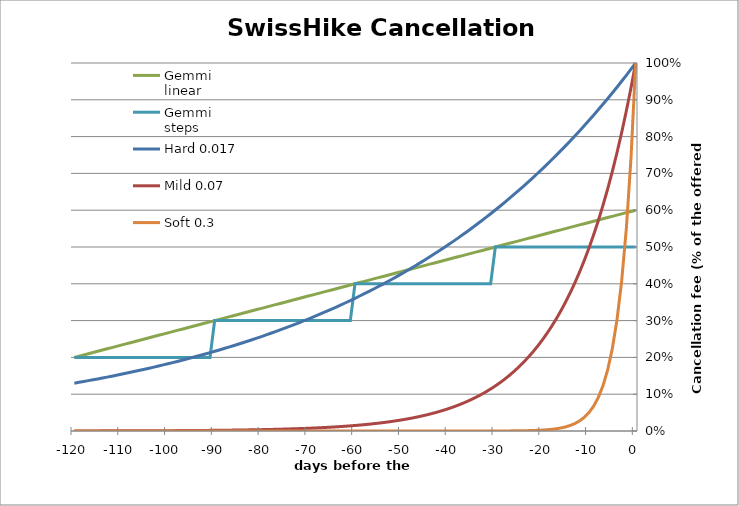
| Category | Gemmi linear | Gemmi steps | Hard 0.017 | Mild 0.07 | Soft 0.3 |
|---|---|---|---|---|---|
| -120.0 | 0.2 | 0.2 | 0.13 | 0 | 0 |
| -119.0 | 0.203 | 0.2 | 0.132 | 0 | 0 |
| -118.0 | 0.207 | 0.2 | 0.135 | 0 | 0 |
| -117.0 | 0.21 | 0.2 | 0.137 | 0 | 0 |
| -116.0 | 0.213 | 0.2 | 0.139 | 0 | 0 |
| -115.0 | 0.217 | 0.2 | 0.142 | 0 | 0 |
| -114.0 | 0.22 | 0.2 | 0.144 | 0 | 0 |
| -113.0 | 0.223 | 0.2 | 0.146 | 0 | 0 |
| -112.0 | 0.227 | 0.2 | 0.149 | 0 | 0 |
| -111.0 | 0.23 | 0.2 | 0.152 | 0 | 0 |
| -110.0 | 0.233 | 0.2 | 0.154 | 0 | 0 |
| -109.0 | 0.237 | 0.2 | 0.157 | 0 | 0 |
| -108.0 | 0.24 | 0.2 | 0.159 | 0.001 | 0 |
| -107.0 | 0.243 | 0.2 | 0.162 | 0.001 | 0 |
| -106.0 | 0.247 | 0.2 | 0.165 | 0.001 | 0 |
| -105.0 | 0.25 | 0.2 | 0.168 | 0.001 | 0 |
| -104.0 | 0.253 | 0.2 | 0.171 | 0.001 | 0 |
| -103.0 | 0.257 | 0.2 | 0.174 | 0.001 | 0 |
| -102.0 | 0.26 | 0.2 | 0.177 | 0.001 | 0 |
| -101.0 | 0.263 | 0.2 | 0.18 | 0.001 | 0 |
| -100.0 | 0.267 | 0.2 | 0.183 | 0.001 | 0 |
| -99.0 | 0.27 | 0.2 | 0.186 | 0.001 | 0 |
| -98.0 | 0.273 | 0.2 | 0.189 | 0.001 | 0 |
| -97.0 | 0.277 | 0.2 | 0.192 | 0.001 | 0 |
| -96.0 | 0.28 | 0.2 | 0.196 | 0.001 | 0 |
| -95.0 | 0.283 | 0.2 | 0.199 | 0.001 | 0 |
| -94.0 | 0.287 | 0.2 | 0.202 | 0.001 | 0 |
| -93.0 | 0.29 | 0.2 | 0.206 | 0.001 | 0 |
| -92.0 | 0.293 | 0.2 | 0.209 | 0.002 | 0 |
| -91.0 | 0.297 | 0.2 | 0.213 | 0.002 | 0 |
| -90.0 | 0.3 | 0.3 | 0.217 | 0.002 | 0 |
| -89.0 | 0.303 | 0.3 | 0.22 | 0.002 | 0 |
| -88.0 | 0.307 | 0.3 | 0.224 | 0.002 | 0 |
| -87.0 | 0.31 | 0.3 | 0.228 | 0.002 | 0 |
| -86.0 | 0.313 | 0.3 | 0.232 | 0.002 | 0 |
| -85.0 | 0.317 | 0.3 | 0.236 | 0.003 | 0 |
| -84.0 | 0.32 | 0.3 | 0.24 | 0.003 | 0 |
| -83.0 | 0.323 | 0.3 | 0.244 | 0.003 | 0 |
| -82.0 | 0.327 | 0.3 | 0.248 | 0.003 | 0 |
| -81.0 | 0.33 | 0.3 | 0.252 | 0.003 | 0 |
| -80.0 | 0.333 | 0.3 | 0.257 | 0.004 | 0 |
| -79.0 | 0.337 | 0.3 | 0.261 | 0.004 | 0 |
| -78.0 | 0.34 | 0.3 | 0.266 | 0.004 | 0 |
| -77.0 | 0.343 | 0.3 | 0.27 | 0.005 | 0 |
| -76.0 | 0.347 | 0.3 | 0.275 | 0.005 | 0 |
| -75.0 | 0.35 | 0.3 | 0.279 | 0.005 | 0 |
| -74.0 | 0.353 | 0.3 | 0.284 | 0.006 | 0 |
| -73.0 | 0.357 | 0.3 | 0.289 | 0.006 | 0 |
| -72.0 | 0.36 | 0.3 | 0.294 | 0.006 | 0 |
| -71.0 | 0.363 | 0.3 | 0.299 | 0.007 | 0 |
| -70.0 | 0.367 | 0.3 | 0.304 | 0.007 | 0 |
| -69.0 | 0.37 | 0.3 | 0.309 | 0.008 | 0 |
| -68.0 | 0.373 | 0.3 | 0.315 | 0.009 | 0 |
| -67.0 | 0.377 | 0.3 | 0.32 | 0.009 | 0 |
| -66.0 | 0.38 | 0.3 | 0.326 | 0.01 | 0 |
| -65.0 | 0.383 | 0.3 | 0.331 | 0.011 | 0 |
| -64.0 | 0.387 | 0.3 | 0.337 | 0.011 | 0 |
| -63.0 | 0.39 | 0.3 | 0.343 | 0.012 | 0 |
| -62.0 | 0.393 | 0.3 | 0.349 | 0.013 | 0 |
| -61.0 | 0.397 | 0.3 | 0.355 | 0.014 | 0 |
| -60.0 | 0.4 | 0.4 | 0.361 | 0.015 | 0 |
| -59.0 | 0.403 | 0.4 | 0.367 | 0.016 | 0 |
| -58.0 | 0.407 | 0.4 | 0.373 | 0.017 | 0 |
| -57.0 | 0.41 | 0.4 | 0.379 | 0.018 | 0 |
| -56.0 | 0.413 | 0.4 | 0.386 | 0.02 | 0 |
| -55.0 | 0.417 | 0.4 | 0.393 | 0.021 | 0 |
| -54.0 | 0.42 | 0.4 | 0.399 | 0.023 | 0 |
| -53.0 | 0.423 | 0.4 | 0.406 | 0.024 | 0 |
| -52.0 | 0.427 | 0.4 | 0.413 | 0.026 | 0 |
| -51.0 | 0.43 | 0.4 | 0.42 | 0.028 | 0 |
| -50.0 | 0.433 | 0.4 | 0.427 | 0.03 | 0 |
| -49.0 | 0.437 | 0.4 | 0.435 | 0.032 | 0 |
| -48.0 | 0.44 | 0.4 | 0.442 | 0.035 | 0 |
| -47.0 | 0.443 | 0.4 | 0.45 | 0.037 | 0 |
| -46.0 | 0.447 | 0.4 | 0.457 | 0.04 | 0 |
| -45.0 | 0.45 | 0.4 | 0.465 | 0.043 | 0 |
| -44.0 | 0.453 | 0.4 | 0.473 | 0.046 | 0 |
| -43.0 | 0.457 | 0.4 | 0.481 | 0.049 | 0 |
| -42.0 | 0.46 | 0.4 | 0.49 | 0.053 | 0 |
| -41.0 | 0.463 | 0.4 | 0.498 | 0.057 | 0 |
| -40.0 | 0.467 | 0.4 | 0.507 | 0.061 | 0 |
| -39.0 | 0.47 | 0.4 | 0.515 | 0.065 | 0 |
| -38.0 | 0.473 | 0.4 | 0.524 | 0.07 | 0 |
| -37.0 | 0.477 | 0.4 | 0.533 | 0.075 | 0 |
| -36.0 | 0.48 | 0.4 | 0.542 | 0.08 | 0 |
| -35.0 | 0.483 | 0.4 | 0.552 | 0.086 | 0 |
| -34.0 | 0.487 | 0.4 | 0.561 | 0.093 | 0 |
| -33.0 | 0.49 | 0.4 | 0.571 | 0.099 | 0 |
| -32.0 | 0.493 | 0.4 | 0.58 | 0.106 | 0 |
| -31.0 | 0.497 | 0.4 | 0.59 | 0.114 | 0 |
| -30.0 | 0.5 | 0.5 | 0.6 | 0.122 | 0 |
| -29.0 | 0.503 | 0.5 | 0.611 | 0.131 | 0 |
| -28.0 | 0.507 | 0.5 | 0.621 | 0.141 | 0 |
| -27.0 | 0.51 | 0.5 | 0.632 | 0.151 | 0 |
| -26.0 | 0.513 | 0.5 | 0.643 | 0.162 | 0 |
| -25.0 | 0.517 | 0.5 | 0.654 | 0.174 | 0.001 |
| -24.0 | 0.52 | 0.5 | 0.665 | 0.186 | 0.001 |
| -23.0 | 0.523 | 0.5 | 0.676 | 0.2 | 0.001 |
| -22.0 | 0.527 | 0.5 | 0.688 | 0.214 | 0.001 |
| -21.0 | 0.53 | 0.5 | 0.7 | 0.23 | 0.002 |
| -20.0 | 0.533 | 0.5 | 0.712 | 0.247 | 0.002 |
| -19.0 | 0.537 | 0.5 | 0.724 | 0.264 | 0.003 |
| -18.0 | 0.54 | 0.5 | 0.736 | 0.284 | 0.005 |
| -17.0 | 0.543 | 0.5 | 0.749 | 0.304 | 0.006 |
| -16.0 | 0.547 | 0.5 | 0.762 | 0.326 | 0.008 |
| -15.0 | 0.55 | 0.5 | 0.775 | 0.35 | 0.011 |
| -14.0 | 0.553 | 0.5 | 0.788 | 0.375 | 0.015 |
| -13.0 | 0.557 | 0.5 | 0.802 | 0.403 | 0.02 |
| -12.0 | 0.56 | 0.5 | 0.815 | 0.432 | 0.027 |
| -11.0 | 0.563 | 0.5 | 0.829 | 0.463 | 0.037 |
| -10.0 | 0.567 | 0.5 | 0.844 | 0.497 | 0.05 |
| -9.0 | 0.57 | 0.5 | 0.858 | 0.533 | 0.067 |
| -8.0 | 0.573 | 0.5 | 0.873 | 0.571 | 0.091 |
| -7.0 | 0.577 | 0.5 | 0.888 | 0.613 | 0.122 |
| -6.0 | 0.58 | 0.5 | 0.903 | 0.657 | 0.165 |
| -5.0 | 0.583 | 0.5 | 0.919 | 0.705 | 0.223 |
| -4.0 | 0.587 | 0.5 | 0.934 | 0.756 | 0.301 |
| -3.0 | 0.59 | 0.5 | 0.95 | 0.811 | 0.407 |
| -2.0 | 0.593 | 0.5 | 0.967 | 0.869 | 0.549 |
| -1.0 | 0.597 | 0.5 | 0.983 | 0.932 | 0.741 |
| 0.0 | 0.6 | 0.5 | 1 | 1 | 1 |